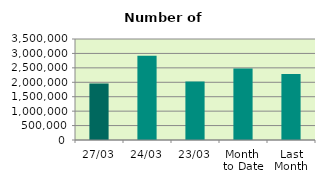
| Category | Series 0 |
|---|---|
| 27/03 | 1961836 |
| 24/03 | 2916368 |
| 23/03 | 2023906 |
| Month 
to Date | 2478584.105 |
| Last
Month | 2290810.7 |